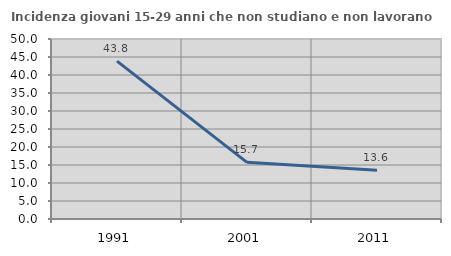
| Category | Incidenza giovani 15-29 anni che non studiano e non lavorano  |
|---|---|
| 1991.0 | 43.849 |
| 2001.0 | 15.746 |
| 2011.0 | 13.553 |